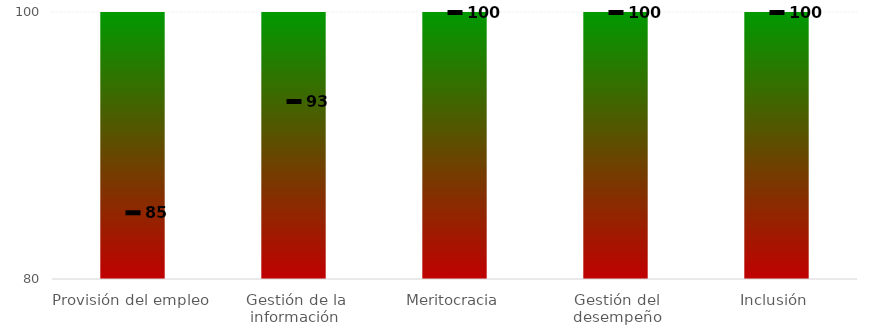
| Category | Niveles |
|---|---|
| Provisión del empleo | 100 |
| Gestión de la información | 100 |
| Meritocracia | 100 |
| Gestión del desempeño | 100 |
| Inclusión | 100 |